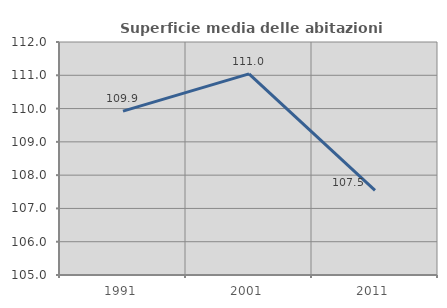
| Category | Superficie media delle abitazioni occupate |
|---|---|
| 1991.0 | 109.924 |
| 2001.0 | 111.043 |
| 2011.0 | 107.54 |